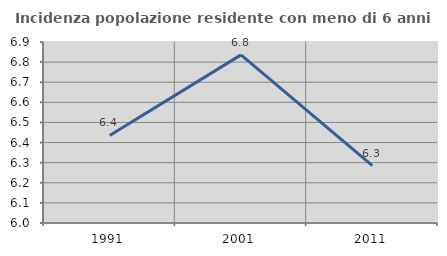
| Category | Incidenza popolazione residente con meno di 6 anni |
|---|---|
| 1991.0 | 6.435 |
| 2001.0 | 6.836 |
| 2011.0 | 6.285 |